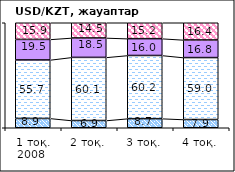
| Category | оң | әсер еткен жоқ | кері | білмеймін |
|---|---|---|---|---|
| 1 тоқ. 2008  | 8.87 | 55.72 | 19.54 | 15.87 |
| 2 тоқ. | 6.89 | 60.12 | 18.51 | 14.47 |
| 3 тоқ. | 8.66 | 60.17 | 16 | 15.16 |
| 4 тоқ. | 7.85 | 58.99 | 16.79 | 16.37 |